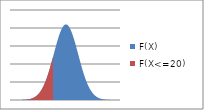
| Category | F(X) | F(X<=20) |
|---|---|---|
| 3.625 | 0 | 0 |
| 3.653 | 0 | 0 |
| 3.681 | 0 | 0 |
| 3.709 | 0 | 0 |
| 3.737 | 0 | 0 |
| 3.765 | 0 | 0 |
| 3.793 | 0 | 0 |
| 3.821 | 0 | 0 |
| 3.849 | 0 | 0 |
| 3.8770000000000002 | 0 | 0 |
| 3.9050000000000002 | 0 | 0 |
| 3.9330000000000003 | 0 | 0 |
| 3.9610000000000003 | 0 | 0 |
| 3.9890000000000003 | 0 | 0 |
| 4.017 | 0 | 0 |
| 4.045 | 0 | 0 |
| 4.0729999999999995 | 0 | 0 |
| 4.100999999999999 | 0 | 0 |
| 4.128999999999999 | 0 | 0 |
| 4.156999999999998 | 0 | 0 |
| 4.184999999999998 | 0 | 0 |
| 4.212999999999997 | 0 | 0 |
| 4.240999999999997 | 0 | 0 |
| 4.268999999999997 | 0 | 0 |
| 4.296999999999996 | 0 | 0 |
| 4.324999999999996 | 0 | 0 |
| 4.352999999999995 | 0 | 0 |
| 4.380999999999995 | 0 | 0 |
| 4.4089999999999945 | 0 | 0 |
| 4.436999999999994 | 0 | 0 |
| 4.464999999999994 | 0 | 0 |
| 4.492999999999993 | 0 | 0 |
| 4.520999999999993 | 0 | 0 |
| 4.548999999999992 | 0 | 0 |
| 4.576999999999992 | 0 | 0 |
| 4.6049999999999915 | 0 | 0 |
| 4.632999999999991 | 0 | 0 |
| 4.660999999999991 | 0 | 0 |
| 4.68899999999999 | 0 | 0 |
| 4.71699999999999 | 0 | 0 |
| 4.7449999999999894 | 0 | 0 |
| 4.772999999999989 | 0 | 0 |
| 4.800999999999989 | 0 | 0 |
| 4.828999999999988 | 0 | 0 |
| 4.856999999999988 | 0 | 0 |
| 4.884999999999987 | 0 | 0 |
| 4.912999999999987 | 0 | 0 |
| 4.9409999999999865 | 0 | 0 |
| 4.968999999999986 | 0 | 0 |
| 4.996999999999986 | 0 | 0 |
| 5.024999999999985 | 0 | 0 |
| 5.052999999999985 | 0 | 0 |
| 5.080999999999984 | 0 | 0 |
| 5.108999999999984 | 0 | 0 |
| 5.136999999999984 | 0 | 0 |
| 5.164999999999983 | 0 | 0 |
| 5.192999999999983 | 0 | 0 |
| 5.220999999999982 | 0 | 0 |
| 5.248999999999982 | 0 | 0 |
| 5.2769999999999815 | 0 | 0 |
| 5.304999999999981 | 0 | 0 |
| 5.332999999999981 | 0 | 0 |
| 5.36099999999998 | 0 | 0 |
| 5.38899999999998 | 0 | 0 |
| 5.416999999999979 | 0 | 0 |
| 5.444999999999979 | 0 | 0 |
| 5.4729999999999785 | 0 | 0 |
| 5.500999999999978 | 0 | 0 |
| 5.528999999999978 | 0 | 0 |
| 5.556999999999977 | 0 | 0 |
| 5.584999999999977 | 0 | 0 |
| 5.6129999999999765 | 0 | 0 |
| 5.640999999999976 | 0 | 0 |
| 5.668999999999976 | 0 | 0 |
| 5.696999999999975 | 0 | 0 |
| 5.724999999999975 | 0 | 0 |
| 5.752999999999974 | 0 | 0 |
| 5.780999999999974 | 0 | 0 |
| 5.8089999999999735 | 0 | 0 |
| 5.836999999999973 | 0 | 0 |
| 5.864999999999973 | 0 | 0 |
| 5.892999999999972 | 0 | 0 |
| 5.920999999999972 | 0 | 0 |
| 5.948999999999971 | 0 | 0 |
| 5.976999999999971 | 0 | 0 |
| 6.004999999999971 | 0 | 0 |
| 6.03299999999997 | 0 | 0 |
| 6.06099999999997 | 0 | 0 |
| 6.088999999999969 | 0 | 0 |
| 6.116999999999969 | 0 | 0 |
| 6.1449999999999685 | 0 | 0 |
| 6.172999999999968 | 0 | 0 |
| 6.200999999999968 | 0 | 0 |
| 6.228999999999967 | 0 | 0 |
| 6.256999999999967 | 0 | 0 |
| 6.284999999999966 | 0 | 0 |
| 6.312999999999966 | 0 | 0 |
| 6.3409999999999656 | 0 | 0 |
| 6.368999999999965 | 0 | 0 |
| 6.396999999999965 | 0 | 0 |
| 6.424999999999964 | 0 | 0 |
| 6.452999999999964 | 0 | 0 |
| 6.4809999999999635 | 0 | 0 |
| 6.508999999999963 | 0 | 0 |
| 6.536999999999963 | 0 | 0 |
| 6.564999999999962 | 0 | 0 |
| 6.592999999999962 | 0 | 0 |
| 6.620999999999961 | 0 | 0 |
| 6.648999999999961 | 0 | 0 |
| 6.6769999999999605 | 0 | 0 |
| 6.70499999999996 | 0 | 0 |
| 6.73299999999996 | 0 | 0 |
| 6.760999999999959 | 0 | 0 |
| 6.788999999999959 | 0 | 0 |
| 6.816999999999958 | 0 | 0 |
| 6.844999999999958 | 0 | 0 |
| 6.872999999999958 | 0 | 0 |
| 6.900999999999957 | 0 | 0 |
| 6.928999999999957 | 0 | 0 |
| 6.956999999999956 | 0 | 0 |
| 6.984999999999956 | 0 | 0 |
| 7.0129999999999555 | 0 | 0 |
| 7.040999999999955 | 0 | 0 |
| 7.068999999999955 | 0 | 0 |
| 7.096999999999954 | 0 | 0 |
| 7.124999999999954 | 0 | 0 |
| 7.152999999999953 | 0 | 0 |
| 7.180999999999953 | 0 | 0 |
| 7.208999999999953 | 0 | 0 |
| 7.236999999999952 | 0 | 0 |
| 7.264999999999952 | 0 | 0 |
| 7.292999999999951 | 0 | 0 |
| 7.320999999999951 | 0 | 0 |
| 7.3489999999999505 | 0 | 0 |
| 7.37699999999995 | 0 | 0 |
| 7.40499999999995 | 0 | 0 |
| 7.432999999999949 | 0 | 0 |
| 7.460999999999949 | 0 | 0 |
| 7.488999999999948 | 0 | 0 |
| 7.516999999999948 | 0 | 0 |
| 7.5449999999999475 | 0 | 0 |
| 7.572999999999947 | 0 | 0 |
| 7.600999999999947 | 0 | 0 |
| 7.628999999999946 | 0 | 0 |
| 7.656999999999946 | 0 | 0 |
| 7.684999999999945 | 0 | 0 |
| 7.712999999999945 | 0 | 0 |
| 7.740999999999945 | 0 | 0 |
| 7.768999999999944 | 0 | 0 |
| 7.796999999999944 | 0 | 0 |
| 7.824999999999943 | 0 | 0 |
| 7.852999999999943 | 0 | 0 |
| 7.8809999999999425 | 0 | 0 |
| 7.908999999999942 | 0 | 0 |
| 7.936999999999942 | 0 | 0 |
| 7.964999999999941 | 0 | 0 |
| 7.992999999999941 | 0 | 0 |
| 8.02099999999994 | 0 | 0 |
| 8.04899999999994 | 0 | 0 |
| 8.076999999999941 | 0 | 0 |
| 8.104999999999942 | 0 | 0 |
| 8.132999999999942 | 0 | 0 |
| 8.160999999999943 | 0 | 0 |
| 8.188999999999943 | 0 | 0 |
| 8.216999999999944 | 0 | 0 |
| 8.244999999999944 | 0 | 0 |
| 8.272999999999945 | 0 | 0 |
| 8.300999999999945 | 0 | 0 |
| 8.328999999999946 | 0 | 0 |
| 8.356999999999946 | 0 | 0 |
| 8.384999999999946 | 0 | 0 |
| 8.412999999999947 | 0 | 0 |
| 8.440999999999947 | 0 | 0 |
| 8.468999999999948 | 0 | 0 |
| 8.496999999999948 | 0 | 0 |
| 8.524999999999949 | 0 | 0 |
| 8.55299999999995 | 0 | 0 |
| 8.58099999999995 | 0 | 0 |
| 8.60899999999995 | 0 | 0 |
| 8.63699999999995 | 0 | 0 |
| 8.664999999999951 | 0 | 0 |
| 8.692999999999952 | 0 | 0 |
| 8.720999999999952 | 0 | 0 |
| 8.748999999999953 | 0 | 0 |
| 8.776999999999953 | 0 | 0 |
| 8.804999999999954 | 0 | 0 |
| 8.832999999999954 | 0 | 0 |
| 8.860999999999954 | 0 | 0 |
| 8.888999999999955 | 0 | 0 |
| 8.916999999999955 | 0 | 0 |
| 8.944999999999956 | 0 | 0 |
| 8.972999999999956 | 0 | 0 |
| 9.000999999999957 | 0 | 0 |
| 9.028999999999957 | 0 | 0 |
| 9.056999999999958 | 0 | 0 |
| 9.084999999999958 | 0 | 0 |
| 9.112999999999959 | 0 | 0 |
| 9.14099999999996 | 0 | 0 |
| 9.16899999999996 | 0 | 0 |
| 9.19699999999996 | 0 | 0 |
| 9.22499999999996 | 0 | 0 |
| 9.252999999999961 | 0 | 0 |
| 9.280999999999962 | 0 | 0 |
| 9.308999999999962 | 0 | 0 |
| 9.336999999999962 | 0 | 0 |
| 9.364999999999963 | 0 | 0 |
| 9.392999999999963 | 0 | 0 |
| 9.420999999999964 | 0 | 0 |
| 9.448999999999964 | 0 | 0 |
| 9.476999999999965 | 0 | 0 |
| 9.504999999999965 | 0 | 0 |
| 9.532999999999966 | 0 | 0 |
| 9.560999999999966 | 0 | 0 |
| 9.588999999999967 | 0 | 0 |
| 9.616999999999967 | 0 | 0 |
| 9.644999999999968 | 0 | 0 |
| 9.672999999999968 | 0 | 0 |
| 9.700999999999969 | 0 | 0 |
| 9.728999999999969 | 0 | 0 |
| 9.75699999999997 | 0 | 0 |
| 9.78499999999997 | 0 | 0 |
| 9.81299999999997 | 0.001 | 0.001 |
| 9.84099999999997 | 0.001 | 0.001 |
| 9.868999999999971 | 0.001 | 0.001 |
| 9.896999999999972 | 0.001 | 0.001 |
| 9.924999999999972 | 0.001 | 0.001 |
| 9.952999999999973 | 0.001 | 0.001 |
| 9.980999999999973 | 0.001 | 0.001 |
| 10.008999999999974 | 0.001 | 0.001 |
| 10.036999999999974 | 0.001 | 0.001 |
| 10.064999999999975 | 0.001 | 0.001 |
| 10.092999999999975 | 0.001 | 0.001 |
| 10.120999999999976 | 0.001 | 0.001 |
| 10.148999999999976 | 0.001 | 0.001 |
| 10.176999999999977 | 0.001 | 0.001 |
| 10.204999999999977 | 0.001 | 0.001 |
| 10.232999999999977 | 0.001 | 0.001 |
| 10.260999999999978 | 0.001 | 0.001 |
| 10.288999999999978 | 0.001 | 0.001 |
| 10.316999999999979 | 0.001 | 0.001 |
| 10.34499999999998 | 0.001 | 0.001 |
| 10.37299999999998 | 0.001 | 0.001 |
| 10.40099999999998 | 0.001 | 0.001 |
| 10.42899999999998 | 0.001 | 0.001 |
| 10.456999999999981 | 0.001 | 0.001 |
| 10.484999999999982 | 0.001 | 0.001 |
| 10.512999999999982 | 0.001 | 0.001 |
| 10.540999999999983 | 0.001 | 0.001 |
| 10.568999999999983 | 0.001 | 0.001 |
| 10.596999999999984 | 0.001 | 0.001 |
| 10.624999999999984 | 0.001 | 0.001 |
| 10.652999999999984 | 0.001 | 0.001 |
| 10.680999999999985 | 0.001 | 0.001 |
| 10.708999999999985 | 0.001 | 0.001 |
| 10.736999999999986 | 0.001 | 0.001 |
| 10.764999999999986 | 0.001 | 0.001 |
| 10.792999999999987 | 0.001 | 0.001 |
| 10.820999999999987 | 0.001 | 0.001 |
| 10.848999999999988 | 0.001 | 0.001 |
| 10.876999999999988 | 0.001 | 0.001 |
| 10.904999999999989 | 0.001 | 0.001 |
| 10.93299999999999 | 0.001 | 0.001 |
| 10.96099999999999 | 0.001 | 0.001 |
| 10.98899999999999 | 0.001 | 0.001 |
| 11.01699999999999 | 0.001 | 0.001 |
| 11.044999999999991 | 0.001 | 0.001 |
| 11.072999999999992 | 0.001 | 0.001 |
| 11.100999999999992 | 0.001 | 0.001 |
| 11.128999999999992 | 0.001 | 0.001 |
| 11.156999999999993 | 0.001 | 0.001 |
| 11.184999999999993 | 0.001 | 0.001 |
| 11.212999999999994 | 0.001 | 0.001 |
| 11.240999999999994 | 0.001 | 0.001 |
| 11.268999999999995 | 0.001 | 0.001 |
| 11.296999999999995 | 0.001 | 0.001 |
| 11.324999999999996 | 0.001 | 0.001 |
| 11.352999999999996 | 0.001 | 0.001 |
| 11.380999999999997 | 0.001 | 0.001 |
| 11.408999999999997 | 0.001 | 0.001 |
| 11.436999999999998 | 0.001 | 0.001 |
| 11.464999999999998 | 0.001 | 0.001 |
| 11.492999999999999 | 0.001 | 0.001 |
| 11.520999999999999 | 0.001 | 0.001 |
| 11.549 | 0.002 | 0.002 |
| 11.577 | 0.002 | 0.002 |
| 11.605 | 0.002 | 0.002 |
| 11.633000000000001 | 0.002 | 0.002 |
| 11.661000000000001 | 0.002 | 0.002 |
| 11.689000000000002 | 0.002 | 0.002 |
| 11.717000000000002 | 0.002 | 0.002 |
| 11.745000000000003 | 0.002 | 0.002 |
| 11.773000000000003 | 0.002 | 0.002 |
| 11.801000000000004 | 0.002 | 0.002 |
| 11.829000000000004 | 0.002 | 0.002 |
| 11.857000000000005 | 0.002 | 0.002 |
| 11.885000000000005 | 0.002 | 0.002 |
| 11.913000000000006 | 0.002 | 0.002 |
| 11.941000000000006 | 0.002 | 0.002 |
| 11.969000000000007 | 0.002 | 0.002 |
| 11.997000000000007 | 0.002 | 0.002 |
| 12.025000000000007 | 0.002 | 0.002 |
| 12.053000000000008 | 0.002 | 0.002 |
| 12.081000000000008 | 0.002 | 0.002 |
| 12.109000000000009 | 0.002 | 0.002 |
| 12.13700000000001 | 0.002 | 0.002 |
| 12.16500000000001 | 0.002 | 0.002 |
| 12.19300000000001 | 0.002 | 0.002 |
| 12.22100000000001 | 0.002 | 0.002 |
| 12.249000000000011 | 0.002 | 0.002 |
| 12.277000000000012 | 0.002 | 0.002 |
| 12.305000000000012 | 0.002 | 0.002 |
| 12.333000000000013 | 0.002 | 0.002 |
| 12.361000000000013 | 0.002 | 0.002 |
| 12.389000000000014 | 0.002 | 0.002 |
| 12.417000000000014 | 0.003 | 0.003 |
| 12.445000000000014 | 0.003 | 0.003 |
| 12.473000000000015 | 0.003 | 0.003 |
| 12.501000000000015 | 0.003 | 0.003 |
| 12.529000000000016 | 0.003 | 0.003 |
| 12.557000000000016 | 0.003 | 0.003 |
| 12.585000000000017 | 0.003 | 0.003 |
| 12.613000000000017 | 0.003 | 0.003 |
| 12.641000000000018 | 0.003 | 0.003 |
| 12.669000000000018 | 0.003 | 0.003 |
| 12.697000000000019 | 0.003 | 0.003 |
| 12.72500000000002 | 0.003 | 0.003 |
| 12.75300000000002 | 0.003 | 0.003 |
| 12.78100000000002 | 0.003 | 0.003 |
| 12.80900000000002 | 0.003 | 0.003 |
| 12.837000000000021 | 0.003 | 0.003 |
| 12.865000000000022 | 0.003 | 0.003 |
| 12.893000000000022 | 0.003 | 0.003 |
| 12.921000000000022 | 0.003 | 0.003 |
| 12.949000000000023 | 0.003 | 0.003 |
| 12.977000000000023 | 0.003 | 0.003 |
| 13.005000000000024 | 0.003 | 0.003 |
| 13.033000000000024 | 0.004 | 0.004 |
| 13.061000000000025 | 0.004 | 0.004 |
| 13.089000000000025 | 0.004 | 0.004 |
| 13.117000000000026 | 0.004 | 0.004 |
| 13.145000000000026 | 0.004 | 0.004 |
| 13.173000000000027 | 0.004 | 0.004 |
| 13.201000000000027 | 0.004 | 0.004 |
| 13.229000000000028 | 0.004 | 0.004 |
| 13.257000000000028 | 0.004 | 0.004 |
| 13.285000000000029 | 0.004 | 0.004 |
| 13.313000000000029 | 0.004 | 0.004 |
| 13.34100000000003 | 0.004 | 0.004 |
| 13.36900000000003 | 0.004 | 0.004 |
| 13.39700000000003 | 0.004 | 0.004 |
| 13.425000000000031 | 0.004 | 0.004 |
| 13.453000000000031 | 0.004 | 0.004 |
| 13.481000000000032 | 0.004 | 0.004 |
| 13.509000000000032 | 0.005 | 0.005 |
| 13.537000000000033 | 0.005 | 0.005 |
| 13.565000000000033 | 0.005 | 0.005 |
| 13.593000000000034 | 0.005 | 0.005 |
| 13.621000000000034 | 0.005 | 0.005 |
| 13.649000000000035 | 0.005 | 0.005 |
| 13.677000000000035 | 0.005 | 0.005 |
| 13.705000000000036 | 0.005 | 0.005 |
| 13.733000000000036 | 0.005 | 0.005 |
| 13.761000000000037 | 0.005 | 0.005 |
| 13.789000000000037 | 0.005 | 0.005 |
| 13.817000000000037 | 0.005 | 0.005 |
| 13.845000000000038 | 0.005 | 0.005 |
| 13.873000000000038 | 0.005 | 0.005 |
| 13.901000000000039 | 0.005 | 0.005 |
| 13.92900000000004 | 0.006 | 0.006 |
| 13.95700000000004 | 0.006 | 0.006 |
| 13.98500000000004 | 0.006 | 0.006 |
| 14.01300000000004 | 0.006 | 0.006 |
| 14.041000000000041 | 0.006 | 0.006 |
| 14.069000000000042 | 0.006 | 0.006 |
| 14.097000000000042 | 0.006 | 0.006 |
| 14.125000000000043 | 0.006 | 0.006 |
| 14.153000000000043 | 0.006 | 0.006 |
| 14.181000000000044 | 0.006 | 0.006 |
| 14.209000000000044 | 0.006 | 0.006 |
| 14.237000000000045 | 0.006 | 0.006 |
| 14.265000000000045 | 0.007 | 0.007 |
| 14.293000000000045 | 0.007 | 0.007 |
| 14.321000000000046 | 0.007 | 0.007 |
| 14.349000000000046 | 0.007 | 0.007 |
| 14.377000000000047 | 0.007 | 0.007 |
| 14.405000000000047 | 0.007 | 0.007 |
| 14.433000000000048 | 0.007 | 0.007 |
| 14.461000000000048 | 0.007 | 0.007 |
| 14.489000000000049 | 0.007 | 0.007 |
| 14.51700000000005 | 0.007 | 0.007 |
| 14.54500000000005 | 0.007 | 0.007 |
| 14.57300000000005 | 0.008 | 0.008 |
| 14.60100000000005 | 0.008 | 0.008 |
| 14.629000000000051 | 0.008 | 0.008 |
| 14.657000000000052 | 0.008 | 0.008 |
| 14.685000000000052 | 0.008 | 0.008 |
| 14.713000000000052 | 0.008 | 0.008 |
| 14.741000000000053 | 0.008 | 0.008 |
| 14.769000000000053 | 0.008 | 0.008 |
| 14.797000000000054 | 0.008 | 0.008 |
| 14.825000000000054 | 0.008 | 0.008 |
| 14.853000000000055 | 0.009 | 0.009 |
| 14.881000000000055 | 0.009 | 0.009 |
| 14.909000000000056 | 0.009 | 0.009 |
| 14.937000000000056 | 0.009 | 0.009 |
| 14.965000000000057 | 0.009 | 0.009 |
| 14.993000000000057 | 0.009 | 0.009 |
| 15.021000000000058 | 0.009 | 0.009 |
| 15.049000000000058 | 0.009 | 0.009 |
| 15.077000000000059 | 0.009 | 0.009 |
| 15.105000000000059 | 0.01 | 0.01 |
| 15.13300000000006 | 0.01 | 0.01 |
| 15.16100000000006 | 0.01 | 0.01 |
| 15.18900000000006 | 0.01 | 0.01 |
| 15.217000000000061 | 0.01 | 0.01 |
| 15.245000000000061 | 0.01 | 0.01 |
| 15.273000000000062 | 0.01 | 0.01 |
| 15.301000000000062 | 0.01 | 0.01 |
| 15.329000000000063 | 0.011 | 0.011 |
| 15.357000000000063 | 0.011 | 0.011 |
| 15.385000000000064 | 0.011 | 0.011 |
| 15.413000000000064 | 0.011 | 0.011 |
| 15.441000000000065 | 0.011 | 0.011 |
| 15.469000000000065 | 0.011 | 0.011 |
| 15.497000000000066 | 0.011 | 0.011 |
| 15.525000000000066 | 0.011 | 0.011 |
| 15.553000000000067 | 0.012 | 0.012 |
| 15.581000000000067 | 0.012 | 0.012 |
| 15.609000000000067 | 0.012 | 0.012 |
| 15.637000000000068 | 0.012 | 0.012 |
| 15.665000000000068 | 0.012 | 0.012 |
| 15.693000000000069 | 0.012 | 0.012 |
| 15.72100000000007 | 0.012 | 0.012 |
| 15.74900000000007 | 0.013 | 0.013 |
| 15.77700000000007 | 0.013 | 0.013 |
| 15.80500000000007 | 0.013 | 0.013 |
| 15.833000000000071 | 0.013 | 0.013 |
| 15.861000000000072 | 0.013 | 0.013 |
| 15.889000000000072 | 0.013 | 0.013 |
| 15.917000000000073 | 0.013 | 0.013 |
| 15.945000000000073 | 0.014 | 0.014 |
| 15.973000000000074 | 0.014 | 0.014 |
| 16.001000000000072 | 0.014 | 0.014 |
| 16.02900000000007 | 0.014 | 0.014 |
| 16.05700000000007 | 0.014 | 0.014 |
| 16.08500000000007 | 0.014 | 0.014 |
| 16.113000000000067 | 0.015 | 0.015 |
| 16.141000000000066 | 0.015 | 0.015 |
| 16.169000000000064 | 0.015 | 0.015 |
| 16.197000000000063 | 0.015 | 0.015 |
| 16.225000000000062 | 0.015 | 0.015 |
| 16.25300000000006 | 0.015 | 0.015 |
| 16.28100000000006 | 0.016 | 0.016 |
| 16.309000000000058 | 0.016 | 0.016 |
| 16.337000000000057 | 0.016 | 0.016 |
| 16.365000000000055 | 0.016 | 0.016 |
| 16.393000000000054 | 0.016 | 0.016 |
| 16.421000000000053 | 0.016 | 0.016 |
| 16.44900000000005 | 0.017 | 0.017 |
| 16.47700000000005 | 0.017 | 0.017 |
| 16.50500000000005 | 0.017 | 0.017 |
| 16.533000000000047 | 0.017 | 0.017 |
| 16.561000000000046 | 0.017 | 0.017 |
| 16.589000000000045 | 0.018 | 0.018 |
| 16.617000000000044 | 0.018 | 0.018 |
| 16.645000000000042 | 0.018 | 0.018 |
| 16.67300000000004 | 0.018 | 0.018 |
| 16.70100000000004 | 0.018 | 0.018 |
| 16.72900000000004 | 0.018 | 0.018 |
| 16.757000000000037 | 0.019 | 0.019 |
| 16.785000000000036 | 0.019 | 0.019 |
| 16.813000000000034 | 0.019 | 0.019 |
| 16.841000000000033 | 0.019 | 0.019 |
| 16.86900000000003 | 0.019 | 0.019 |
| 16.89700000000003 | 0.02 | 0.02 |
| 16.92500000000003 | 0.02 | 0.02 |
| 16.953000000000028 | 0.02 | 0.02 |
| 16.981000000000027 | 0.02 | 0.02 |
| 17.009000000000025 | 0.02 | 0.02 |
| 17.037000000000024 | 0.021 | 0.021 |
| 17.065000000000023 | 0.021 | 0.021 |
| 17.09300000000002 | 0.021 | 0.021 |
| 17.12100000000002 | 0.021 | 0.021 |
| 17.14900000000002 | 0.021 | 0.021 |
| 17.177000000000017 | 0.022 | 0.022 |
| 17.205000000000016 | 0.022 | 0.022 |
| 17.233000000000015 | 0.022 | 0.022 |
| 17.261000000000013 | 0.022 | 0.022 |
| 17.289000000000012 | 0.022 | 0.022 |
| 17.31700000000001 | 0.023 | 0.023 |
| 17.34500000000001 | 0.023 | 0.023 |
| 17.373000000000008 | 0.023 | 0.023 |
| 17.401000000000007 | 0.023 | 0.023 |
| 17.429000000000006 | 0.024 | 0.024 |
| 17.457000000000004 | 0.024 | 0.024 |
| 17.485000000000003 | 0.024 | 0.024 |
| 17.513 | 0.024 | 0.024 |
| 17.541 | 0.024 | 0.024 |
| 17.569 | 0.025 | 0.025 |
| 17.596999999999998 | 0.025 | 0.025 |
| 17.624999999999996 | 0.025 | 0.025 |
| 17.652999999999995 | 0.025 | 0.025 |
| 17.680999999999994 | 0.026 | 0.026 |
| 17.708999999999993 | 0.026 | 0.026 |
| 17.73699999999999 | 0.026 | 0.026 |
| 17.76499999999999 | 0.026 | 0.026 |
| 17.79299999999999 | 0.027 | 0.027 |
| 17.820999999999987 | 0.027 | 0.027 |
| 17.848999999999986 | 0.027 | 0.027 |
| 17.876999999999985 | 0.027 | 0.027 |
| 17.904999999999983 | 0.028 | 0.028 |
| 17.932999999999982 | 0.028 | 0.028 |
| 17.96099999999998 | 0.028 | 0.028 |
| 17.98899999999998 | 0.028 | 0.028 |
| 18.016999999999978 | 0.029 | 0.029 |
| 18.044999999999977 | 0.029 | 0.029 |
| 18.072999999999976 | 0.029 | 0.029 |
| 18.100999999999974 | 0.029 | 0.029 |
| 18.128999999999973 | 0.03 | 0.03 |
| 18.15699999999997 | 0.03 | 0.03 |
| 18.18499999999997 | 0.03 | 0.03 |
| 18.21299999999997 | 0.03 | 0.03 |
| 18.240999999999968 | 0.031 | 0.031 |
| 18.268999999999966 | 0.031 | 0.031 |
| 18.296999999999965 | 0.031 | 0.031 |
| 18.324999999999964 | 0.031 | 0.031 |
| 18.352999999999962 | 0.032 | 0.032 |
| 18.38099999999996 | 0.032 | 0.032 |
| 18.40899999999996 | 0.032 | 0.032 |
| 18.43699999999996 | 0.032 | 0.032 |
| 18.464999999999957 | 0.033 | 0.033 |
| 18.492999999999956 | 0.033 | 0.033 |
| 18.520999999999955 | 0.033 | 0.033 |
| 18.548999999999953 | 0.033 | 0.033 |
| 18.576999999999952 | 0.034 | 0.034 |
| 18.60499999999995 | 0.034 | 0.034 |
| 18.63299999999995 | 0.034 | 0.034 |
| 18.660999999999948 | 0.034 | 0.034 |
| 18.688999999999947 | 0.035 | 0.035 |
| 18.716999999999945 | 0.035 | 0.035 |
| 18.744999999999944 | 0.035 | 0.035 |
| 18.772999999999943 | 0.036 | 0.036 |
| 18.80099999999994 | 0.036 | 0.036 |
| 18.82899999999994 | 0.036 | 0.036 |
| 18.85699999999994 | 0.036 | 0.036 |
| 18.884999999999938 | 0.037 | 0.037 |
| 18.912999999999936 | 0.037 | 0.037 |
| 18.940999999999935 | 0.037 | 0.037 |
| 18.968999999999934 | 0.038 | 0.038 |
| 18.996999999999932 | 0.038 | 0.038 |
| 19.02499999999993 | 0.038 | 0.038 |
| 19.05299999999993 | 0.038 | 0.038 |
| 19.08099999999993 | 0.039 | 0.039 |
| 19.108999999999927 | 0.039 | 0.039 |
| 19.136999999999926 | 0.039 | 0.039 |
| 19.164999999999925 | 0.039 | 0.039 |
| 19.192999999999923 | 0.04 | 0.04 |
| 19.220999999999922 | 0.04 | 0.04 |
| 19.24899999999992 | 0.04 | 0.04 |
| 19.27699999999992 | 0.041 | 0.041 |
| 19.304999999999918 | 0.041 | 0.041 |
| 19.332999999999917 | 0.041 | 0.041 |
| 19.360999999999915 | 0.042 | 0.042 |
| 19.388999999999914 | 0.042 | 0.042 |
| 19.416999999999913 | 0.042 | 0.042 |
| 19.44499999999991 | 0.042 | 0.042 |
| 19.47299999999991 | 0.043 | 0.043 |
| 19.50099999999991 | 0.043 | 0.043 |
| 19.528999999999908 | 0.043 | 0.043 |
| 19.556999999999906 | 0.044 | 0.044 |
| 19.584999999999905 | 0.044 | 0.044 |
| 19.612999999999904 | 0.044 | 0.044 |
| 19.640999999999902 | 0.044 | 0.044 |
| 19.6689999999999 | 0.045 | 0.045 |
| 19.6969999999999 | 0.045 | 0.045 |
| 19.7249999999999 | 0.045 | 0.045 |
| 19.752999999999897 | 0.046 | 0.046 |
| 19.780999999999896 | 0.046 | 0.046 |
| 19.808999999999894 | 0.046 | 0.046 |
| 19.836999999999893 | 0.047 | 0.047 |
| 19.864999999999892 | 0.047 | 0.047 |
| 19.89299999999989 | 0.047 | 0.047 |
| 19.92099999999989 | 0.047 | 0.047 |
| 19.948999999999888 | 0.048 | 0.048 |
| 19.976999999999887 | 0.048 | 0.048 |
| 20.004999999999885 | 0.048 | 0 |
| 20.032999999999884 | 0.049 | 0 |
| 20.060999999999883 | 0.049 | 0 |
| 20.08899999999988 | 0.049 | 0 |
| 20.11699999999988 | 0.05 | 0 |
| 20.14499999999988 | 0.05 | 0 |
| 20.172999999999877 | 0.05 | 0 |
| 20.200999999999876 | 0.05 | 0 |
| 20.228999999999875 | 0.051 | 0 |
| 20.256999999999874 | 0.051 | 0 |
| 20.284999999999872 | 0.051 | 0 |
| 20.31299999999987 | 0.052 | 0 |
| 20.34099999999987 | 0.052 | 0 |
| 20.36899999999987 | 0.052 | 0 |
| 20.396999999999867 | 0.053 | 0 |
| 20.424999999999866 | 0.053 | 0 |
| 20.452999999999864 | 0.053 | 0 |
| 20.480999999999863 | 0.053 | 0 |
| 20.508999999999862 | 0.054 | 0 |
| 20.53699999999986 | 0.054 | 0 |
| 20.56499999999986 | 0.054 | 0 |
| 20.592999999999858 | 0.055 | 0 |
| 20.620999999999857 | 0.055 | 0 |
| 20.648999999999855 | 0.055 | 0 |
| 20.676999999999854 | 0.056 | 0 |
| 20.704999999999853 | 0.056 | 0 |
| 20.73299999999985 | 0.056 | 0 |
| 20.76099999999985 | 0.056 | 0 |
| 20.78899999999985 | 0.057 | 0 |
| 20.816999999999847 | 0.057 | 0 |
| 20.844999999999846 | 0.057 | 0 |
| 20.872999999999845 | 0.058 | 0 |
| 20.900999999999843 | 0.058 | 0 |
| 20.928999999999842 | 0.058 | 0 |
| 20.95699999999984 | 0.058 | 0 |
| 20.98499999999984 | 0.059 | 0 |
| 21.01299999999984 | 0.059 | 0 |
| 21.040999999999837 | 0.059 | 0 |
| 21.068999999999836 | 0.06 | 0 |
| 21.096999999999834 | 0.06 | 0 |
| 21.124999999999833 | 0.06 | 0 |
| 21.15299999999983 | 0.061 | 0 |
| 21.18099999999983 | 0.061 | 0 |
| 21.20899999999983 | 0.061 | 0 |
| 21.236999999999828 | 0.061 | 0 |
| 21.264999999999826 | 0.062 | 0 |
| 21.292999999999825 | 0.062 | 0 |
| 21.320999999999824 | 0.062 | 0 |
| 21.348999999999823 | 0.063 | 0 |
| 21.37699999999982 | 0.063 | 0 |
| 21.40499999999982 | 0.063 | 0 |
| 21.43299999999982 | 0.063 | 0 |
| 21.460999999999817 | 0.064 | 0 |
| 21.488999999999816 | 0.064 | 0 |
| 21.516999999999815 | 0.064 | 0 |
| 21.544999999999813 | 0.064 | 0 |
| 21.572999999999812 | 0.065 | 0 |
| 21.60099999999981 | 0.065 | 0 |
| 21.62899999999981 | 0.065 | 0 |
| 21.656999999999808 | 0.066 | 0 |
| 21.684999999999807 | 0.066 | 0 |
| 21.712999999999806 | 0.066 | 0 |
| 21.740999999999804 | 0.066 | 0 |
| 21.768999999999803 | 0.067 | 0 |
| 21.7969999999998 | 0.067 | 0 |
| 21.8249999999998 | 0.067 | 0 |
| 21.8529999999998 | 0.067 | 0 |
| 21.880999999999798 | 0.068 | 0 |
| 21.908999999999796 | 0.068 | 0 |
| 21.936999999999795 | 0.068 | 0 |
| 21.964999999999794 | 0.068 | 0 |
| 21.992999999999792 | 0.069 | 0 |
| 22.02099999999979 | 0.069 | 0 |
| 22.04899999999979 | 0.069 | 0 |
| 22.07699999999979 | 0.07 | 0 |
| 22.104999999999787 | 0.07 | 0 |
| 22.132999999999786 | 0.07 | 0 |
| 22.160999999999785 | 0.07 | 0 |
| 22.188999999999783 | 0.07 | 0 |
| 22.216999999999782 | 0.071 | 0 |
| 22.24499999999978 | 0.071 | 0 |
| 22.27299999999978 | 0.071 | 0 |
| 22.300999999999778 | 0.071 | 0 |
| 22.328999999999777 | 0.072 | 0 |
| 22.356999999999775 | 0.072 | 0 |
| 22.384999999999774 | 0.072 | 0 |
| 22.412999999999773 | 0.072 | 0 |
| 22.44099999999977 | 0.073 | 0 |
| 22.46899999999977 | 0.073 | 0 |
| 22.49699999999977 | 0.073 | 0 |
| 22.524999999999768 | 0.073 | 0 |
| 22.552999999999766 | 0.074 | 0 |
| 22.580999999999765 | 0.074 | 0 |
| 22.608999999999764 | 0.074 | 0 |
| 22.636999999999762 | 0.074 | 0 |
| 22.66499999999976 | 0.074 | 0 |
| 22.69299999999976 | 0.075 | 0 |
| 22.72099999999976 | 0.075 | 0 |
| 22.748999999999757 | 0.075 | 0 |
| 22.776999999999756 | 0.075 | 0 |
| 22.804999999999755 | 0.075 | 0 |
| 22.832999999999753 | 0.076 | 0 |
| 22.860999999999752 | 0.076 | 0 |
| 22.88899999999975 | 0.076 | 0 |
| 22.91699999999975 | 0.076 | 0 |
| 22.944999999999748 | 0.076 | 0 |
| 22.972999999999747 | 0.077 | 0 |
| 23.000999999999745 | 0.077 | 0 |
| 23.028999999999744 | 0.077 | 0 |
| 23.056999999999743 | 0.077 | 0 |
| 23.08499999999974 | 0.077 | 0 |
| 23.11299999999974 | 0.078 | 0 |
| 23.14099999999974 | 0.078 | 0 |
| 23.168999999999738 | 0.078 | 0 |
| 23.196999999999736 | 0.078 | 0 |
| 23.224999999999735 | 0.078 | 0 |
| 23.252999999999734 | 0.078 | 0 |
| 23.280999999999732 | 0.079 | 0 |
| 23.30899999999973 | 0.079 | 0 |
| 23.33699999999973 | 0.079 | 0 |
| 23.36499999999973 | 0.079 | 0 |
| 23.392999999999727 | 0.079 | 0 |
| 23.420999999999726 | 0.079 | 0 |
| 23.448999999999725 | 0.08 | 0 |
| 23.476999999999723 | 0.08 | 0 |
| 23.504999999999722 | 0.08 | 0 |
| 23.53299999999972 | 0.08 | 0 |
| 23.56099999999972 | 0.08 | 0 |
| 23.588999999999718 | 0.08 | 0 |
| 23.616999999999717 | 0.081 | 0 |
| 23.644999999999715 | 0.081 | 0 |
| 23.672999999999714 | 0.081 | 0 |
| 23.700999999999713 | 0.081 | 0 |
| 23.72899999999971 | 0.081 | 0 |
| 23.75699999999971 | 0.081 | 0 |
| 23.78499999999971 | 0.081 | 0 |
| 23.812999999999708 | 0.081 | 0 |
| 23.840999999999706 | 0.082 | 0 |
| 23.868999999999705 | 0.082 | 0 |
| 23.896999999999704 | 0.082 | 0 |
| 23.924999999999702 | 0.082 | 0 |
| 23.9529999999997 | 0.082 | 0 |
| 23.9809999999997 | 0.082 | 0 |
| 24.0089999999997 | 0.082 | 0 |
| 24.036999999999697 | 0.082 | 0 |
| 24.064999999999696 | 0.082 | 0 |
| 24.092999999999694 | 0.082 | 0 |
| 24.120999999999693 | 0.083 | 0 |
| 24.148999999999692 | 0.083 | 0 |
| 24.17699999999969 | 0.083 | 0 |
| 24.20499999999969 | 0.083 | 0 |
| 24.232999999999688 | 0.083 | 0 |
| 24.260999999999687 | 0.083 | 0 |
| 24.288999999999685 | 0.083 | 0 |
| 24.316999999999684 | 0.083 | 0 |
| 24.344999999999683 | 0.083 | 0 |
| 24.37299999999968 | 0.083 | 0 |
| 24.40099999999968 | 0.083 | 0 |
| 24.42899999999968 | 0.083 | 0 |
| 24.456999999999677 | 0.083 | 0 |
| 24.484999999999676 | 0.083 | 0 |
| 24.512999999999675 | 0.084 | 0 |
| 24.540999999999674 | 0.084 | 0 |
| 24.568999999999672 | 0.084 | 0 |
| 24.59699999999967 | 0.084 | 0 |
| 24.62499999999967 | 0.084 | 0 |
| 24.65299999999967 | 0.084 | 0 |
| 24.680999999999667 | 0.084 | 0 |
| 24.708999999999666 | 0.084 | 0 |
| 24.736999999999664 | 0.084 | 0 |
| 24.764999999999663 | 0.084 | 0 |
| 24.79299999999966 | 0.084 | 0 |
| 24.82099999999966 | 0.084 | 0 |
| 24.84899999999966 | 0.084 | 0 |
| 24.876999999999658 | 0.084 | 0 |
| 24.904999999999657 | 0.084 | 0 |
| 24.932999999999655 | 0.084 | 0 |
| 24.960999999999654 | 0.084 | 0 |
| 24.988999999999653 | 0.084 | 0 |
| 25.01699999999965 | 0.084 | 0 |
| 25.04499999999965 | 0.084 | 0 |
| 25.07299999999965 | 0.084 | 0 |
| 25.100999999999647 | 0.084 | 0 |
| 25.128999999999646 | 0.084 | 0 |
| 25.156999999999645 | 0.084 | 0 |
| 25.184999999999643 | 0.084 | 0 |
| 25.212999999999642 | 0.084 | 0 |
| 25.24099999999964 | 0.084 | 0 |
| 25.26899999999964 | 0.084 | 0 |
| 25.296999999999638 | 0.084 | 0 |
| 25.324999999999637 | 0.084 | 0 |
| 25.352999999999636 | 0.084 | 0 |
| 25.380999999999634 | 0.084 | 0 |
| 25.408999999999633 | 0.084 | 0 |
| 25.43699999999963 | 0.084 | 0 |
| 25.46499999999963 | 0.084 | 0 |
| 25.49299999999963 | 0.084 | 0 |
| 25.520999999999628 | 0.083 | 0 |
| 25.548999999999626 | 0.083 | 0 |
| 25.576999999999625 | 0.083 | 0 |
| 25.604999999999624 | 0.083 | 0 |
| 25.632999999999623 | 0.083 | 0 |
| 25.66099999999962 | 0.083 | 0 |
| 25.68899999999962 | 0.083 | 0 |
| 25.71699999999962 | 0.083 | 0 |
| 25.744999999999617 | 0.083 | 0 |
| 25.772999999999616 | 0.083 | 0 |
| 25.800999999999615 | 0.083 | 0 |
| 25.828999999999613 | 0.083 | 0 |
| 25.856999999999612 | 0.083 | 0 |
| 25.88499999999961 | 0.083 | 0 |
| 25.91299999999961 | 0.082 | 0 |
| 25.940999999999608 | 0.082 | 0 |
| 25.968999999999607 | 0.082 | 0 |
| 25.996999999999606 | 0.082 | 0 |
| 26.024999999999604 | 0.082 | 0 |
| 26.052999999999603 | 0.082 | 0 |
| 26.0809999999996 | 0.082 | 0 |
| 26.1089999999996 | 0.082 | 0 |
| 26.1369999999996 | 0.082 | 0 |
| 26.164999999999598 | 0.081 | 0 |
| 26.192999999999596 | 0.081 | 0 |
| 26.220999999999595 | 0.081 | 0 |
| 26.248999999999594 | 0.081 | 0 |
| 26.276999999999592 | 0.081 | 0 |
| 26.30499999999959 | 0.081 | 0 |
| 26.33299999999959 | 0.081 | 0 |
| 26.36099999999959 | 0.081 | 0 |
| 26.388999999999587 | 0.08 | 0 |
| 26.416999999999586 | 0.08 | 0 |
| 26.444999999999585 | 0.08 | 0 |
| 26.472999999999583 | 0.08 | 0 |
| 26.500999999999582 | 0.08 | 0 |
| 26.52899999999958 | 0.08 | 0 |
| 26.55699999999958 | 0.08 | 0 |
| 26.584999999999578 | 0.079 | 0 |
| 26.612999999999577 | 0.079 | 0 |
| 26.640999999999575 | 0.079 | 0 |
| 26.668999999999574 | 0.079 | 0 |
| 26.696999999999573 | 0.079 | 0 |
| 26.72499999999957 | 0.079 | 0 |
| 26.75299999999957 | 0.078 | 0 |
| 26.78099999999957 | 0.078 | 0 |
| 26.808999999999568 | 0.078 | 0 |
| 26.836999999999566 | 0.078 | 0 |
| 26.864999999999565 | 0.078 | 0 |
| 26.892999999999564 | 0.078 | 0 |
| 26.920999999999562 | 0.077 | 0 |
| 26.94899999999956 | 0.077 | 0 |
| 26.97699999999956 | 0.077 | 0 |
| 27.00499999999956 | 0.077 | 0 |
| 27.032999999999557 | 0.077 | 0 |
| 27.060999999999556 | 0.076 | 0 |
| 27.088999999999555 | 0.076 | 0 |
| 27.116999999999553 | 0.076 | 0 |
| 27.144999999999552 | 0.076 | 0 |
| 27.17299999999955 | 0.076 | 0 |
| 27.20099999999955 | 0.075 | 0 |
| 27.228999999999548 | 0.075 | 0 |
| 27.256999999999547 | 0.075 | 0 |
| 27.284999999999545 | 0.075 | 0 |
| 27.312999999999544 | 0.075 | 0 |
| 27.340999999999543 | 0.074 | 0 |
| 27.36899999999954 | 0.074 | 0 |
| 27.39699999999954 | 0.074 | 0 |
| 27.42499999999954 | 0.074 | 0 |
| 27.452999999999538 | 0.074 | 0 |
| 27.480999999999536 | 0.073 | 0 |
| 27.508999999999535 | 0.073 | 0 |
| 27.536999999999534 | 0.073 | 0 |
| 27.564999999999532 | 0.073 | 0 |
| 27.59299999999953 | 0.072 | 0 |
| 27.62099999999953 | 0.072 | 0 |
| 27.64899999999953 | 0.072 | 0 |
| 27.676999999999527 | 0.072 | 0 |
| 27.704999999999526 | 0.071 | 0 |
| 27.732999999999524 | 0.071 | 0 |
| 27.760999999999523 | 0.071 | 0 |
| 27.788999999999522 | 0.071 | 0 |
| 27.81699999999952 | 0.07 | 0 |
| 27.84499999999952 | 0.07 | 0 |
| 27.872999999999518 | 0.07 | 0 |
| 27.900999999999517 | 0.07 | 0 |
| 27.928999999999515 | 0.069 | 0 |
| 27.956999999999514 | 0.069 | 0 |
| 27.984999999999513 | 0.069 | 0 |
| 28.01299999999951 | 0.069 | 0 |
| 28.04099999999951 | 0.068 | 0 |
| 28.06899999999951 | 0.068 | 0 |
| 28.096999999999507 | 0.068 | 0 |
| 28.124999999999506 | 0.068 | 0 |
| 28.152999999999505 | 0.067 | 0 |
| 28.180999999999504 | 0.067 | 0 |
| 28.208999999999502 | 0.067 | 0 |
| 28.2369999999995 | 0.067 | 0 |
| 28.2649999999995 | 0.066 | 0 |
| 28.2929999999995 | 0.066 | 0 |
| 28.320999999999497 | 0.066 | 0 |
| 28.348999999999496 | 0.066 | 0 |
| 28.376999999999494 | 0.065 | 0 |
| 28.404999999999493 | 0.065 | 0 |
| 28.432999999999492 | 0.065 | 0 |
| 28.46099999999949 | 0.064 | 0 |
| 28.48899999999949 | 0.064 | 0 |
| 28.516999999999488 | 0.064 | 0 |
| 28.544999999999487 | 0.064 | 0 |
| 28.572999999999485 | 0.063 | 0 |
| 28.600999999999484 | 0.063 | 0 |
| 28.628999999999483 | 0.063 | 0 |
| 28.65699999999948 | 0.062 | 0 |
| 28.68499999999948 | 0.062 | 0 |
| 28.71299999999948 | 0.062 | 0 |
| 28.740999999999477 | 0.062 | 0 |
| 28.768999999999476 | 0.061 | 0 |
| 28.796999999999475 | 0.061 | 0 |
| 28.824999999999473 | 0.061 | 0 |
| 28.852999999999472 | 0.06 | 0 |
| 28.88099999999947 | 0.06 | 0 |
| 28.90899999999947 | 0.06 | 0 |
| 28.93699999999947 | 0.06 | 0 |
| 28.964999999999467 | 0.059 | 0 |
| 28.992999999999466 | 0.059 | 0 |
| 29.020999999999464 | 0.059 | 0 |
| 29.048999999999463 | 0.058 | 0 |
| 29.07699999999946 | 0.058 | 0 |
| 29.10499999999946 | 0.058 | 0 |
| 29.13299999999946 | 0.058 | 0 |
| 29.160999999999458 | 0.057 | 0 |
| 29.188999999999456 | 0.057 | 0 |
| 29.216999999999455 | 0.057 | 0 |
| 29.244999999999454 | 0.056 | 0 |
| 29.272999999999453 | 0.056 | 0 |
| 29.30099999999945 | 0.056 | 0 |
| 29.32899999999945 | 0.055 | 0 |
| 29.35699999999945 | 0.055 | 0 |
| 29.384999999999447 | 0.055 | 0 |
| 29.412999999999446 | 0.055 | 0 |
| 29.440999999999445 | 0.054 | 0 |
| 29.468999999999443 | 0.054 | 0 |
| 29.496999999999442 | 0.054 | 0 |
| 29.52499999999944 | 0.053 | 0 |
| 29.55299999999944 | 0.053 | 0 |
| 29.580999999999438 | 0.053 | 0 |
| 29.608999999999437 | 0.052 | 0 |
| 29.636999999999436 | 0.052 | 0 |
| 29.664999999999434 | 0.052 | 0 |
| 29.692999999999433 | 0.052 | 0 |
| 29.72099999999943 | 0.051 | 0 |
| 29.74899999999943 | 0.051 | 0 |
| 29.77699999999943 | 0.051 | 0 |
| 29.804999999999428 | 0.05 | 0 |
| 29.832999999999426 | 0.05 | 0 |
| 29.860999999999425 | 0.05 | 0 |
| 29.888999999999424 | 0.049 | 0 |
| 29.916999999999422 | 0.049 | 0 |
| 29.94499999999942 | 0.049 | 0 |
| 29.97299999999942 | 0.049 | 0 |
| 30.00099999999942 | 0.048 | 0 |
| 30.028999999999417 | 0.048 | 0 |
| 30.056999999999416 | 0.048 | 0 |
| 30.084999999999415 | 0.047 | 0 |
| 30.112999999999413 | 0.047 | 0 |
| 30.140999999999412 | 0.047 | 0 |
| 30.16899999999941 | 0.046 | 0 |
| 30.19699999999941 | 0.046 | 0 |
| 30.224999999999408 | 0.046 | 0 |
| 30.252999999999407 | 0.046 | 0 |
| 30.280999999999406 | 0.045 | 0 |
| 30.308999999999404 | 0.045 | 0 |
| 30.336999999999403 | 0.045 | 0 |
| 30.3649999999994 | 0.044 | 0 |
| 30.3929999999994 | 0.044 | 0 |
| 30.4209999999994 | 0.044 | 0 |
| 30.448999999999398 | 0.043 | 0 |
| 30.476999999999396 | 0.043 | 0 |
| 30.504999999999395 | 0.043 | 0 |
| 30.532999999999394 | 0.043 | 0 |
| 30.560999999999392 | 0.042 | 0 |
| 30.58899999999939 | 0.042 | 0 |
| 30.61699999999939 | 0.042 | 0 |
| 30.64499999999939 | 0.041 | 0 |
| 30.672999999999387 | 0.041 | 0 |
| 30.700999999999386 | 0.041 | 0 |
| 30.728999999999385 | 0.041 | 0 |
| 30.756999999999383 | 0.04 | 0 |
| 30.784999999999382 | 0.04 | 0 |
| 30.81299999999938 | 0.04 | 0 |
| 30.84099999999938 | 0.039 | 0 |
| 30.868999999999378 | 0.039 | 0 |
| 30.896999999999377 | 0.039 | 0 |
| 30.924999999999375 | 0.039 | 0 |
| 30.952999999999374 | 0.038 | 0 |
| 30.980999999999373 | 0.038 | 0 |
| 31.00899999999937 | 0.038 | 0 |
| 31.03699999999937 | 0.037 | 0 |
| 31.06499999999937 | 0.037 | 0 |
| 31.092999999999368 | 0.037 | 0 |
| 31.120999999999366 | 0.037 | 0 |
| 31.148999999999365 | 0.036 | 0 |
| 31.176999999999364 | 0.036 | 0 |
| 31.204999999999362 | 0.036 | 0 |
| 31.23299999999936 | 0.036 | 0 |
| 31.26099999999936 | 0.035 | 0 |
| 31.28899999999936 | 0.035 | 0 |
| 31.316999999999357 | 0.035 | 0 |
| 31.344999999999356 | 0.034 | 0 |
| 31.372999999999355 | 0.034 | 0 |
| 31.400999999999353 | 0.034 | 0 |
| 31.428999999999352 | 0.034 | 0 |
| 31.45699999999935 | 0.033 | 0 |
| 31.48499999999935 | 0.033 | 0 |
| 31.512999999999348 | 0.033 | 0 |
| 31.540999999999347 | 0.033 | 0 |
| 31.568999999999345 | 0.032 | 0 |
| 31.596999999999344 | 0.032 | 0 |
| 31.624999999999343 | 0.032 | 0 |
| 31.65299999999934 | 0.031 | 0 |
| 31.68099999999934 | 0.031 | 0 |
| 31.70899999999934 | 0.031 | 0 |
| 31.736999999999338 | 0.031 | 0 |
| 31.764999999999336 | 0.03 | 0 |
| 31.792999999999335 | 0.03 | 0 |
| 31.820999999999334 | 0.03 | 0 |
| 31.848999999999332 | 0.03 | 0 |
| 31.87699999999933 | 0.029 | 0 |
| 31.90499999999933 | 0.029 | 0 |
| 31.93299999999933 | 0.029 | 0 |
| 31.960999999999327 | 0.029 | 0 |
| 31.988999999999326 | 0.028 | 0 |
| 32.01699999999933 | 0.028 | 0 |
| 32.04499999999933 | 0.028 | 0 |
| 32.072999999999325 | 0.028 | 0 |
| 32.100999999999324 | 0.027 | 0 |
| 32.12899999999932 | 0.027 | 0 |
| 32.15699999999932 | 0.027 | 0 |
| 32.18499999999932 | 0.027 | 0 |
| 32.21299999999932 | 0.027 | 0 |
| 32.24099999999932 | 0.026 | 0 |
| 32.268999999999316 | 0.026 | 0 |
| 32.296999999999315 | 0.026 | 0 |
| 32.324999999999314 | 0.026 | 0 |
| 32.35299999999931 | 0.025 | 0 |
| 32.38099999999931 | 0.025 | 0 |
| 32.40899999999931 | 0.025 | 0 |
| 32.43699999999931 | 0.025 | 0 |
| 32.46499999999931 | 0.024 | 0 |
| 32.492999999999306 | 0.024 | 0 |
| 32.520999999999304 | 0.024 | 0 |
| 32.5489999999993 | 0.024 | 0 |
| 32.5769999999993 | 0.024 | 0 |
| 32.6049999999993 | 0.023 | 0 |
| 32.6329999999993 | 0.023 | 0 |
| 32.6609999999993 | 0.023 | 0 |
| 32.6889999999993 | 0.023 | 0 |
| 32.716999999999295 | 0.022 | 0 |
| 32.744999999999294 | 0.022 | 0 |
| 32.77299999999929 | 0.022 | 0 |
| 32.80099999999929 | 0.022 | 0 |
| 32.82899999999929 | 0.022 | 0 |
| 32.85699999999929 | 0.021 | 0 |
| 32.88499999999929 | 0.021 | 0 |
| 32.912999999999286 | 0.021 | 0 |
| 32.940999999999285 | 0.021 | 0 |
| 32.96899999999928 | 0.021 | 0 |
| 32.99699999999928 | 0.02 | 0 |
| 33.02499999999928 | 0.02 | 0 |
| 33.05299999999928 | 0.02 | 0 |
| 33.08099999999928 | 0.02 | 0 |
| 33.10899999999928 | 0.02 | 0 |
| 33.136999999999276 | 0.019 | 0 |
| 33.164999999999274 | 0.019 | 0 |
| 33.19299999999927 | 0.019 | 0 |
| 33.22099999999927 | 0.019 | 0 |
| 33.24899999999927 | 0.019 | 0 |
| 33.27699999999927 | 0.018 | 0 |
| 33.30499999999927 | 0.018 | 0 |
| 33.33299999999927 | 0.018 | 0 |
| 33.360999999999265 | 0.018 | 0 |
| 33.388999999999264 | 0.018 | 0 |
| 33.41699999999926 | 0.017 | 0 |
| 33.44499999999926 | 0.017 | 0 |
| 33.47299999999926 | 0.017 | 0 |
| 33.50099999999926 | 0.017 | 0 |
| 33.52899999999926 | 0.017 | 0 |
| 33.556999999999256 | 0.017 | 0 |
| 33.584999999999255 | 0.016 | 0 |
| 33.61299999999925 | 0.016 | 0 |
| 33.64099999999925 | 0.016 | 0 |
| 33.66899999999925 | 0.016 | 0 |
| 33.69699999999925 | 0.016 | 0 |
| 33.72499999999925 | 0.016 | 0 |
| 33.75299999999925 | 0.015 | 0 |
| 33.780999999999246 | 0.015 | 0 |
| 33.808999999999244 | 0.015 | 0 |
| 33.83699999999924 | 0.015 | 0 |
| 33.86499999999924 | 0.015 | 0 |
| 33.89299999999924 | 0.015 | 0 |
| 33.92099999999924 | 0.014 | 0 |
| 33.94899999999924 | 0.014 | 0 |
| 33.97699999999924 | 0.014 | 0 |
| 34.004999999999235 | 0.014 | 0 |
| 34.032999999999234 | 0.014 | 0 |
| 34.06099999999923 | 0.014 | 0 |
| 34.08899999999923 | 0.013 | 0 |
| 34.11699999999923 | 0.013 | 0 |
| 34.14499999999923 | 0.013 | 0 |
| 34.17299999999923 | 0.013 | 0 |
| 34.200999999999226 | 0.013 | 0 |
| 34.228999999999225 | 0.013 | 0 |
| 34.25699999999922 | 0.013 | 0 |
| 34.28499999999922 | 0.012 | 0 |
| 34.31299999999922 | 0.012 | 0 |
| 34.34099999999922 | 0.012 | 0 |
| 34.36899999999922 | 0.012 | 0 |
| 34.39699999999922 | 0.012 | 0 |
| 34.424999999999216 | 0.012 | 0 |
| 34.452999999999214 | 0.012 | 0 |
| 34.48099999999921 | 0.011 | 0 |
| 34.50899999999921 | 0.011 | 0 |
| 34.53699999999921 | 0.011 | 0 |
| 34.56499999999921 | 0.011 | 0 |
| 34.59299999999921 | 0.011 | 0 |
| 34.620999999999206 | 0.011 | 0 |
| 34.648999999999205 | 0.011 | 0 |
| 34.676999999999204 | 0.011 | 0 |
| 34.7049999999992 | 0.01 | 0 |
| 34.7329999999992 | 0.01 | 0 |
| 34.7609999999992 | 0.01 | 0 |
| 34.7889999999992 | 0.01 | 0 |
| 34.8169999999992 | 0.01 | 0 |
| 34.844999999999196 | 0.01 | 0 |
| 34.872999999999195 | 0.01 | 0 |
| 34.90099999999919 | 0.01 | 0 |
| 34.92899999999919 | 0.009 | 0 |
| 34.95699999999919 | 0.009 | 0 |
| 34.98499999999919 | 0.009 | 0 |
| 35.01299999999919 | 0.009 | 0 |
| 35.04099999999919 | 0.009 | 0 |
| 35.068999999999185 | 0.009 | 0 |
| 35.096999999999184 | 0.009 | 0 |
| 35.12499999999918 | 0.009 | 0 |
| 35.15299999999918 | 0.009 | 0 |
| 35.18099999999918 | 0.008 | 0 |
| 35.20899999999918 | 0.008 | 0 |
| 35.23699999999918 | 0.008 | 0 |
| 35.264999999999176 | 0.008 | 0 |
| 35.292999999999175 | 0.008 | 0 |
| 35.320999999999174 | 0.008 | 0 |
| 35.34899999999917 | 0.008 | 0 |
| 35.37699999999917 | 0.008 | 0 |
| 35.40499999999917 | 0.008 | 0 |
| 35.43299999999917 | 0.008 | 0 |
| 35.46099999999917 | 0.007 | 0 |
| 35.488999999999166 | 0.007 | 0 |
| 35.516999999999165 | 0.007 | 0 |
| 35.54499999999916 | 0.007 | 0 |
| 35.57299999999916 | 0.007 | 0 |
| 35.60099999999916 | 0.007 | 0 |
| 35.62899999999916 | 0.007 | 0 |
| 35.65699999999916 | 0.007 | 0 |
| 35.68499999999916 | 0.007 | 0 |
| 35.712999999999155 | 0.007 | 0 |
| 35.740999999999154 | 0.007 | 0 |
| 35.76899999999915 | 0.006 | 0 |
| 35.79699999999915 | 0.006 | 0 |
| 35.82499999999915 | 0.006 | 0 |
| 35.85299999999915 | 0.006 | 0 |
| 35.88099999999915 | 0.006 | 0 |
| 35.908999999999146 | 0.006 | 0 |
| 35.936999999999145 | 0.006 | 0 |
| 35.964999999999144 | 0.006 | 0 |
| 35.99299999999914 | 0.006 | 0 |
| 36.02099999999914 | 0.006 | 0 |
| 36.04899999999914 | 0.006 | 0 |
| 36.07699999999914 | 0.006 | 0 |
| 36.10499999999914 | 0.005 | 0 |
| 36.132999999999136 | 0.005 | 0 |
| 36.160999999999135 | 0.005 | 0 |
| 36.18899999999913 | 0.005 | 0 |
| 36.21699999999913 | 0.005 | 0 |
| 36.24499999999913 | 0.005 | 0 |
| 36.27299999999913 | 0.005 | 0 |
| 36.30099999999913 | 0.005 | 0 |
| 36.32899999999913 | 0.005 | 0 |
| 36.356999999999125 | 0.005 | 0 |
| 36.384999999999124 | 0.005 | 0 |
| 36.41299999999912 | 0.005 | 0 |
| 36.44099999999912 | 0.005 | 0 |
| 36.46899999999912 | 0.005 | 0 |
| 36.49699999999912 | 0.004 | 0 |
| 36.52499999999912 | 0.004 | 0 |
| 36.552999999999116 | 0.004 | 0 |
| 36.580999999999115 | 0.004 | 0 |
| 36.608999999999114 | 0.004 | 0 |
| 36.63699999999911 | 0.004 | 0 |
| 36.66499999999911 | 0.004 | 0 |
| 36.69299999999911 | 0.004 | 0 |
| 36.72099999999911 | 0.004 | 0 |
| 36.74899999999911 | 0.004 | 0 |
| 36.776999999999106 | 0.004 | 0 |
| 36.804999999999104 | 0.004 | 0 |
| 36.8329999999991 | 0.004 | 0 |
| 36.8609999999991 | 0.004 | 0 |
| 36.8889999999991 | 0.004 | 0 |
| 36.9169999999991 | 0.004 | 0 |
| 36.9449999999991 | 0.004 | 0 |
| 36.9729999999991 | 0.004 | 0 |
| 37.000999999999095 | 0.003 | 0 |
| 37.028999999999094 | 0.003 | 0 |
| 37.05699999999909 | 0.003 | 0 |
| 37.08499999999909 | 0.003 | 0 |
| 37.11299999999909 | 0.003 | 0 |
| 37.14099999999909 | 0.003 | 0 |
| 37.16899999999909 | 0.003 | 0 |
| 37.196999999999086 | 0.003 | 0 |
| 37.224999999999085 | 0.003 | 0 |
| 37.25299999999908 | 0.003 | 0 |
| 37.28099999999908 | 0.003 | 0 |
| 37.30899999999908 | 0.003 | 0 |
| 37.33699999999908 | 0.003 | 0 |
| 37.36499999999908 | 0.003 | 0 |
| 37.39299999999908 | 0.003 | 0 |
| 37.420999999999076 | 0.003 | 0 |
| 37.448999999999074 | 0.003 | 0 |
| 37.47699999999907 | 0.003 | 0 |
| 37.50499999999907 | 0.003 | 0 |
| 37.53299999999907 | 0.003 | 0 |
| 37.56099999999907 | 0.003 | 0 |
| 37.58899999999907 | 0.003 | 0 |
| 37.61699999999907 | 0.002 | 0 |
| 37.644999999999065 | 0.002 | 0 |
| 37.672999999999064 | 0.002 | 0 |
| 37.70099999999906 | 0.002 | 0 |
| 37.72899999999906 | 0.002 | 0 |
| 37.75699999999906 | 0.002 | 0 |
| 37.78499999999906 | 0.002 | 0 |
| 37.81299999999906 | 0.002 | 0 |
| 37.840999999999056 | 0.002 | 0 |
| 37.868999999999055 | 0.002 | 0 |
| 37.89699999999905 | 0.002 | 0 |
| 37.92499999999905 | 0.002 | 0 |
| 37.95299999999905 | 0.002 | 0 |
| 37.98099999999905 | 0.002 | 0 |
| 38.00899999999905 | 0.002 | 0 |
| 38.03699999999905 | 0.002 | 0 |
| 38.064999999999046 | 0.002 | 0 |
| 38.092999999999044 | 0.002 | 0 |
| 38.12099999999904 | 0.002 | 0 |
| 38.14899999999904 | 0.002 | 0 |
| 38.17699999999904 | 0.002 | 0 |
| 38.20499999999904 | 0.002 | 0 |
| 38.23299999999904 | 0.002 | 0 |
| 38.260999999999036 | 0.002 | 0 |
| 38.288999999999035 | 0.002 | 0 |
| 38.316999999999034 | 0.002 | 0 |
| 38.34499999999903 | 0.002 | 0 |
| 38.37299999999903 | 0.002 | 0 |
| 38.40099999999903 | 0.002 | 0 |
| 38.42899999999903 | 0.002 | 0 |
| 38.45699999999903 | 0.002 | 0 |
| 38.484999999999026 | 0.001 | 0 |
| 38.512999999999025 | 0.001 | 0 |
| 38.54099999999902 | 0.001 | 0 |
| 38.56899999999902 | 0.001 | 0 |
| 38.59699999999902 | 0.001 | 0 |
| 38.62499999999902 | 0.001 | 0 |
| 38.65299999999902 | 0.001 | 0 |
| 38.68099999999902 | 0.001 | 0 |
| 38.708999999999016 | 0.001 | 0 |
| 38.736999999999014 | 0.001 | 0 |
| 38.76499999999901 | 0.001 | 0 |
| 38.79299999999901 | 0.001 | 0 |
| 38.82099999999901 | 0.001 | 0 |
| 38.84899999999901 | 0.001 | 0 |
| 38.87699999999901 | 0.001 | 0 |
| 38.904999999999006 | 0.001 | 0 |
| 38.932999999999005 | 0.001 | 0 |
| 38.960999999999004 | 0.001 | 0 |
| 38.988999999999 | 0.001 | 0 |
| 39.016999999999 | 0.001 | 0 |
| 39.044999999999 | 0.001 | 0 |
| 39.072999999999 | 0.001 | 0 |
| 39.100999999999 | 0.001 | 0 |
| 39.128999999998996 | 0.001 | 0 |
| 39.156999999998995 | 0.001 | 0 |
| 39.18499999999899 | 0.001 | 0 |
| 39.21299999999899 | 0.001 | 0 |
| 39.24099999999899 | 0.001 | 0 |
| 39.26899999999899 | 0.001 | 0 |
| 39.29699999999899 | 0.001 | 0 |
| 39.32499999999899 | 0.001 | 0 |
| 39.352999999998985 | 0.001 | 0 |
| 39.380999999998984 | 0.001 | 0 |
| 39.40899999999898 | 0.001 | 0 |
| 39.43699999999898 | 0.001 | 0 |
| 39.46499999999898 | 0.001 | 0 |
| 39.49299999999898 | 0.001 | 0 |
| 39.52099999999898 | 0.001 | 0 |
| 39.548999999998976 | 0.001 | 0 |
| 39.576999999998975 | 0.001 | 0 |
| 39.604999999998974 | 0.001 | 0 |
| 39.63299999999897 | 0.001 | 0 |
| 39.66099999999897 | 0.001 | 0 |
| 39.68899999999897 | 0.001 | 0 |
| 39.71699999999897 | 0.001 | 0 |
| 39.74499999999897 | 0.001 | 0 |
| 39.772999999998966 | 0.001 | 0 |
| 39.800999999998965 | 0.001 | 0 |
| 39.82899999999896 | 0.001 | 0 |
| 39.85699999999896 | 0.001 | 0 |
| 39.88499999999896 | 0.001 | 0 |
| 39.91299999999896 | 0.001 | 0 |
| 39.94099999999896 | 0.001 | 0 |
| 39.96899999999896 | 0.001 | 0 |
| 39.996999999998955 | 0.001 | 0 |
| 40.024999999998954 | 0.001 | 0 |
| 40.05299999999895 | 0.001 | 0 |
| 40.08099999999895 | 0.001 | 0 |
| 40.10899999999895 | 0.001 | 0 |
| 40.13699999999895 | 0.001 | 0 |
| 40.16499999999895 | 0.001 | 0 |
| 40.192999999998946 | 0.001 | 0 |
| 40.220999999998945 | 0 | 0 |
| 40.248999999998944 | 0 | 0 |
| 40.27699999999894 | 0 | 0 |
| 40.30499999999894 | 0 | 0 |
| 40.33299999999894 | 0 | 0 |
| 40.36099999999894 | 0 | 0 |
| 40.38899999999894 | 0 | 0 |
| 40.416999999998936 | 0 | 0 |
| 40.444999999998934 | 0 | 0 |
| 40.47299999999893 | 0 | 0 |
| 40.50099999999893 | 0 | 0 |
| 40.52899999999893 | 0 | 0 |
| 40.55699999999893 | 0 | 0 |
| 40.58499999999893 | 0 | 0 |
| 40.61299999999893 | 0 | 0 |
| 40.640999999998925 | 0 | 0 |
| 40.668999999998924 | 0 | 0 |
| 40.69699999999892 | 0 | 0 |
| 40.72499999999892 | 0 | 0 |
| 40.75299999999892 | 0 | 0 |
| 40.78099999999892 | 0 | 0 |
| 40.80899999999892 | 0 | 0 |
| 40.836999999998916 | 0 | 0 |
| 40.864999999998915 | 0 | 0 |
| 40.89299999999891 | 0 | 0 |
| 40.92099999999891 | 0 | 0 |
| 40.94899999999891 | 0 | 0 |
| 40.97699999999891 | 0 | 0 |
| 41.00499999999891 | 0 | 0 |
| 41.03299999999891 | 0 | 0 |
| 41.060999999998906 | 0 | 0 |
| 41.088999999998904 | 0 | 0 |
| 41.1169999999989 | 0 | 0 |
| 41.1449999999989 | 0 | 0 |
| 41.1729999999989 | 0 | 0 |
| 41.2009999999989 | 0 | 0 |
| 41.2289999999989 | 0 | 0 |
| 41.2569999999989 | 0 | 0 |
| 41.284999999998895 | 0 | 0 |
| 41.312999999998894 | 0 | 0 |
| 41.34099999999889 | 0 | 0 |
| 41.36899999999889 | 0 | 0 |
| 41.39699999999889 | 0 | 0 |
| 41.42499999999889 | 0 | 0 |
| 41.45299999999889 | 0 | 0 |
| 41.480999999998886 | 0 | 0 |
| 41.508999999998885 | 0 | 0 |
| 41.53699999999888 | 0 | 0 |
| 41.56499999999888 | 0 | 0 |
| 41.59299999999888 | 0 | 0 |
| 41.62099999999888 | 0 | 0 |
| 41.64899999999888 | 0 | 0 |
| 41.67699999999888 | 0 | 0 |
| 41.704999999998876 | 0 | 0 |
| 41.732999999998874 | 0 | 0 |
| 41.76099999999887 | 0 | 0 |
| 41.78899999999887 | 0 | 0 |
| 41.81699999999887 | 0 | 0 |
| 41.84499999999887 | 0 | 0 |
| 41.87299999999887 | 0 | 0 |
| 41.90099999999887 | 0 | 0 |
| 41.928999999998865 | 0 | 0 |
| 41.956999999998864 | 0 | 0 |
| 41.98499999999886 | 0 | 0 |
| 42.01299999999886 | 0 | 0 |
| 42.04099999999886 | 0 | 0 |
| 42.06899999999886 | 0 | 0 |
| 42.09699999999886 | 0 | 0 |
| 42.124999999998856 | 0 | 0 |
| 42.152999999998855 | 0 | 0 |
| 42.18099999999885 | 0 | 0 |
| 42.20899999999885 | 0 | 0 |
| 42.23699999999885 | 0 | 0 |
| 42.26499999999885 | 0 | 0 |
| 42.29299999999885 | 0 | 0 |
| 42.32099999999885 | 0 | 0 |
| 42.348999999998846 | 0 | 0 |
| 42.376999999998844 | 0 | 0 |
| 42.40499999999884 | 0 | 0 |
| 42.43299999999884 | 0 | 0 |
| 42.46099999999884 | 0 | 0 |
| 42.48899999999884 | 0 | 0 |
| 42.51699999999884 | 0 | 0 |
| 42.544999999998836 | 0 | 0 |
| 42.572999999998835 | 0 | 0 |
| 42.600999999998834 | 0 | 0 |
| 42.62899999999883 | 0 | 0 |
| 42.65699999999883 | 0 | 0 |
| 42.68499999999883 | 0 | 0 |
| 42.71299999999883 | 0 | 0 |
| 42.74099999999883 | 0 | 0 |
| 42.768999999998826 | 0 | 0 |
| 42.796999999998825 | 0 | 0 |
| 42.82499999999882 | 0 | 0 |
| 42.85299999999882 | 0 | 0 |
| 42.88099999999882 | 0 | 0 |
| 42.90899999999882 | 0 | 0 |
| 42.93699999999882 | 0 | 0 |
| 42.96499999999882 | 0 | 0 |
| 42.992999999998815 | 0 | 0 |
| 43.020999999998814 | 0 | 0 |
| 43.04899999999881 | 0 | 0 |
| 43.07699999999881 | 0 | 0 |
| 43.10499999999881 | 0 | 0 |
| 43.13299999999881 | 0 | 0 |
| 43.16099999999881 | 0 | 0 |
| 43.188999999998806 | 0 | 0 |
| 43.216999999998805 | 0 | 0 |
| 43.244999999998804 | 0 | 0 |
| 43.2729999999988 | 0 | 0 |
| 43.3009999999988 | 0 | 0 |
| 43.3289999999988 | 0 | 0 |
| 43.3569999999988 | 0 | 0 |
| 43.3849999999988 | 0 | 0 |
| 43.412999999998796 | 0 | 0 |
| 43.440999999998795 | 0 | 0 |
| 43.46899999999879 | 0 | 0 |
| 43.49699999999879 | 0 | 0 |
| 43.52499999999879 | 0 | 0 |
| 43.55299999999879 | 0 | 0 |
| 43.58099999999879 | 0 | 0 |
| 43.60899999999879 | 0 | 0 |
| 43.636999999998785 | 0 | 0 |
| 43.664999999998784 | 0 | 0 |
| 43.69299999999878 | 0 | 0 |
| 43.72099999999878 | 0 | 0 |
| 43.74899999999878 | 0 | 0 |
| 43.77699999999878 | 0 | 0 |
| 43.80499999999878 | 0 | 0 |
| 43.832999999998776 | 0 | 0 |
| 43.860999999998775 | 0 | 0 |
| 43.888999999998774 | 0 | 0 |
| 43.91699999999877 | 0 | 0 |
| 43.94499999999877 | 0 | 0 |
| 43.97299999999877 | 0 | 0 |
| 44.00099999999877 | 0 | 0 |
| 44.02899999999877 | 0 | 0 |
| 44.056999999998766 | 0 | 0 |
| 44.084999999998765 | 0 | 0 |
| 44.11299999999876 | 0 | 0 |
| 44.14099999999876 | 0 | 0 |
| 44.16899999999876 | 0 | 0 |
| 44.19699999999876 | 0 | 0 |
| 44.22499999999876 | 0 | 0 |
| 44.25299999999876 | 0 | 0 |
| 44.280999999998755 | 0 | 0 |
| 44.308999999998754 | 0 | 0 |
| 44.33699999999875 | 0 | 0 |
| 44.36499999999875 | 0 | 0 |
| 44.39299999999875 | 0 | 0 |
| 44.42099999999875 | 0 | 0 |
| 44.44899999999875 | 0 | 0 |
| 44.476999999998746 | 0 | 0 |
| 44.504999999998745 | 0 | 0 |
| 44.532999999998744 | 0 | 0 |
| 44.56099999999874 | 0 | 0 |
| 44.58899999999874 | 0 | 0 |
| 44.61699999999874 | 0 | 0 |
| 44.64499999999874 | 0 | 0 |
| 44.67299999999874 | 0 | 0 |
| 44.700999999998736 | 0 | 0 |
| 44.728999999998734 | 0 | 0 |
| 44.75699999999873 | 0 | 0 |
| 44.78499999999873 | 0 | 0 |
| 44.81299999999873 | 0 | 0 |
| 44.84099999999873 | 0 | 0 |
| 44.86899999999873 | 0 | 0 |
| 44.89699999999873 | 0 | 0 |
| 44.924999999998725 | 0 | 0 |
| 44.952999999998724 | 0 | 0 |
| 44.98099999999872 | 0 | 0 |
| 45.00899999999872 | 0 | 0 |
| 45.03699999999872 | 0 | 0 |
| 45.06499999999872 | 0 | 0 |
| 45.09299999999872 | 0 | 0 |
| 45.120999999998716 | 0 | 0 |
| 45.148999999998715 | 0 | 0 |
| 45.17699999999871 | 0 | 0 |
| 45.20499999999871 | 0 | 0 |
| 45.23299999999871 | 0 | 0 |
| 45.26099999999871 | 0 | 0 |
| 45.28899999999871 | 0 | 0 |
| 45.31699999999871 | 0 | 0 |
| 45.344999999998706 | 0 | 0 |
| 45.372999999998704 | 0 | 0 |
| 45.4009999999987 | 0 | 0 |
| 45.4289999999987 | 0 | 0 |
| 45.4569999999987 | 0 | 0 |
| 45.4849999999987 | 0 | 0 |
| 45.5129999999987 | 0 | 0 |
| 45.5409999999987 | 0 | 0 |
| 45.568999999998695 | 0 | 0 |
| 45.596999999998694 | 0 | 0 |
| 45.62499999999869 | 0 | 0 |
| 45.65299999999869 | 0 | 0 |
| 45.68099999999869 | 0 | 0 |
| 45.70899999999869 | 0 | 0 |
| 45.73699999999869 | 0 | 0 |
| 45.764999999998686 | 0 | 0 |
| 45.792999999998685 | 0 | 0 |
| 45.82099999999868 | 0 | 0 |
| 45.84899999999868 | 0 | 0 |
| 45.87699999999868 | 0 | 0 |
| 45.90499999999868 | 0 | 0 |
| 45.93299999999868 | 0 | 0 |
| 45.96099999999868 | 0 | 0 |
| 45.988999999998676 | 0 | 0 |
| 46.016999999998674 | 0 | 0 |
| 46.04499999999867 | 0 | 0 |
| 46.07299999999867 | 0 | 0 |
| 46.10099999999867 | 0 | 0 |
| 46.12899999999867 | 0 | 0 |
| 46.15699999999867 | 0 | 0 |
| 46.18499999999867 | 0 | 0 |
| 46.212999999998665 | 0 | 0 |
| 46.240999999998664 | 0 | 0 |
| 46.26899999999866 | 0 | 0 |
| 46.29699999999866 | 0 | 0 |
| 46.32499999999866 | 0 | 0 |
| 46.35299999999866 | 0 | 0 |
| 46.38099999999866 | 0 | 0 |
| 46.408999999998656 | 0 | 0 |